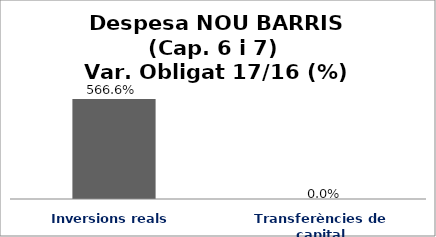
| Category | Series 0 |
|---|---|
| Inversions reals | 5.666 |
| Transferències de capital | 0 |